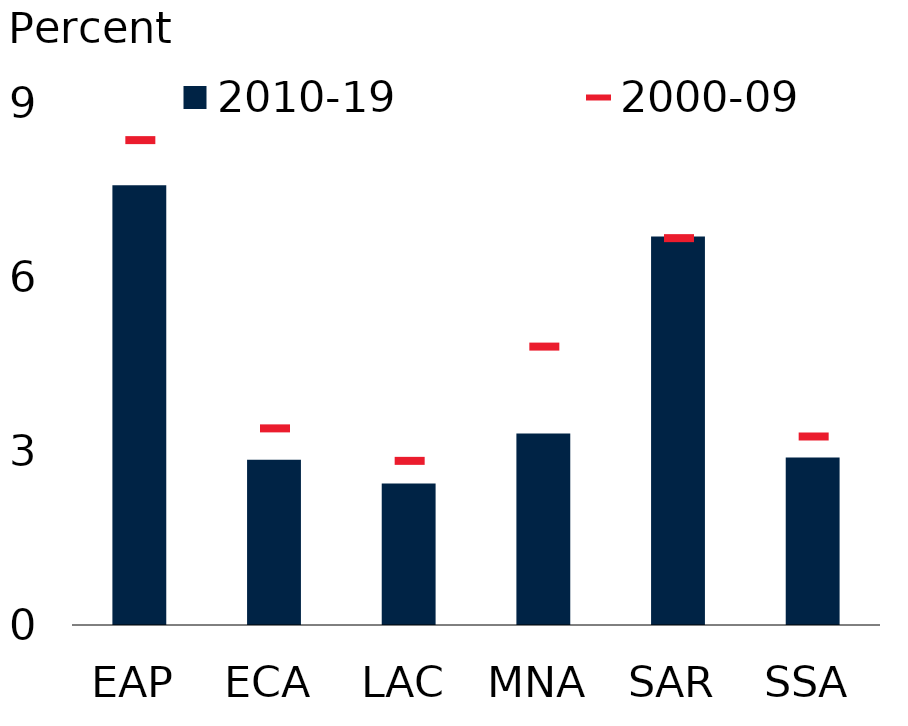
| Category | 2010-19 |
|---|---|
| EAP | 7.58 |
| ECA | 2.85 |
| LAC | 2.44 |
| MNA | 3.3 |
| SAR | 6.7 |
| SSA | 2.89 |